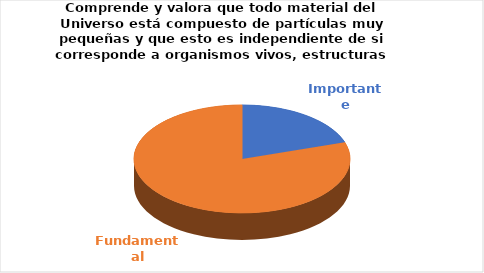
| Category | Series 0 |
|---|---|
| Importante | 2 |
| Fundamental | 8 |